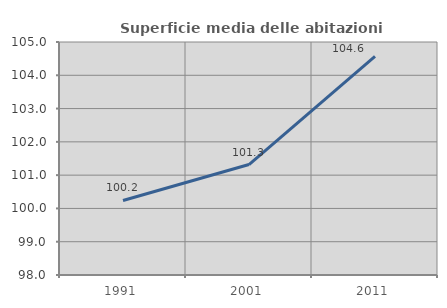
| Category | Superficie media delle abitazioni occupate |
|---|---|
| 1991.0 | 100.239 |
| 2001.0 | 101.318 |
| 2011.0 | 104.568 |